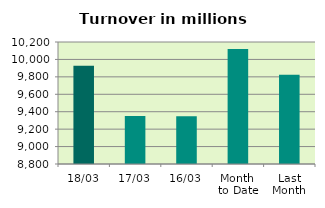
| Category | Series 0 |
|---|---|
| 18/03 | 9926.817 |
| 17/03 | 9352.002 |
| 16/03 | 9348.977 |
| Month 
to Date | 10121.054 |
| Last
Month | 9824.278 |